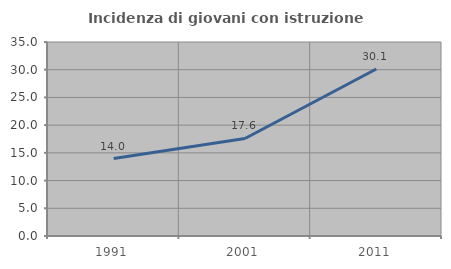
| Category | Incidenza di giovani con istruzione universitaria |
|---|---|
| 1991.0 | 13.965 |
| 2001.0 | 17.591 |
| 2011.0 | 30.12 |